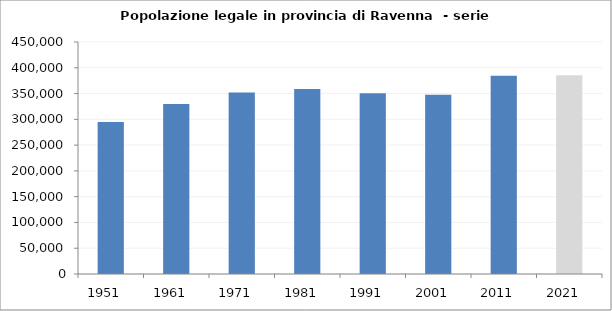
| Category | Popolazione legale |
|---|---|
| 1951   | 294719 |
| 1961   | 329559 |
| 1971   | 351876 |
| 1981   | 358654 |
| 1991   | 350454 |
| 2001   | 347847 |
| 2011   | 384761 |
| 2021   | 385631 |